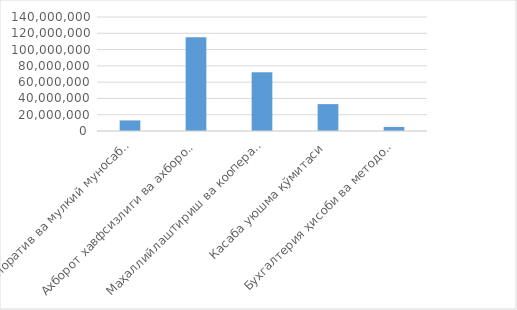
| Category | Товар / хизматнинг
жами суммаси
(cумда) 
(ҚҚС билан) |
|---|---|
| Корпоратив ва мулкий муносабатлар бошқармаси | 13000000 |
| Ахборот хавфсизлиги ва ахборот технологияларини ривожлантириш бошқармаси | 115000000 |
| Маҳаллийлаштириш ва кооперация алоқаларини ривожлантириш бошқармаси | 72000000 |
| Касаба уюшма қўмитаси | 33000000 |
| Бухгалтерия ҳисоби ва методология бошқармаси | 5000000 |